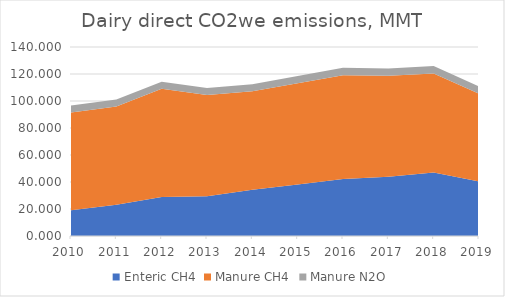
| Category | Enteric CH4 | Manure CH4 | Manure N2O |
|---|---|---|---|
| 2010.0 | 19.063 | 72.477 | 5.035 |
| 2011.0 | 23.131 | 72.872 | 5.114 |
| 2012.0 | 28.801 | 80.357 | 5.168 |
| 2013.0 | 29.468 | 74.956 | 5.141 |
| 2014.0 | 34.226 | 72.995 | 5.194 |
| 2015.0 | 38.127 | 74.998 | 5.326 |
| 2016.0 | 42.179 | 76.987 | 5.38 |
| 2017.0 | 43.908 | 74.812 | 5.406 |
| 2018.0 | 47.112 | 73.318 | 5.459 |
| 2019.0 | 40.449 | 65.021 | 5.38 |